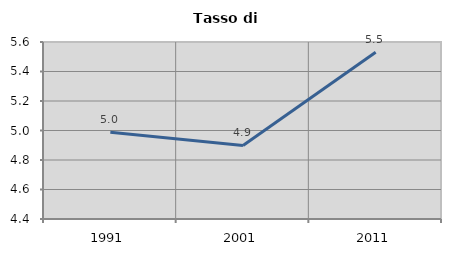
| Category | Tasso di disoccupazione   |
|---|---|
| 1991.0 | 4.989 |
| 2001.0 | 4.899 |
| 2011.0 | 5.53 |